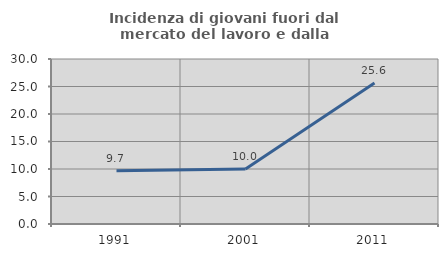
| Category | Incidenza di giovani fuori dal mercato del lavoro e dalla formazione  |
|---|---|
| 1991.0 | 9.677 |
| 2001.0 | 10 |
| 2011.0 | 25.641 |